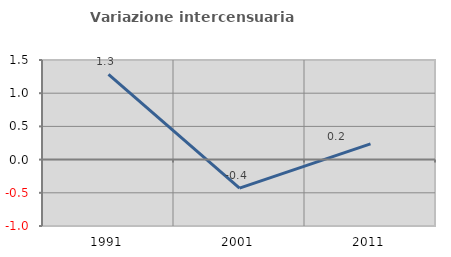
| Category | Variazione intercensuaria annua |
|---|---|
| 1991.0 | 1.285 |
| 2001.0 | -0.429 |
| 2011.0 | 0.237 |